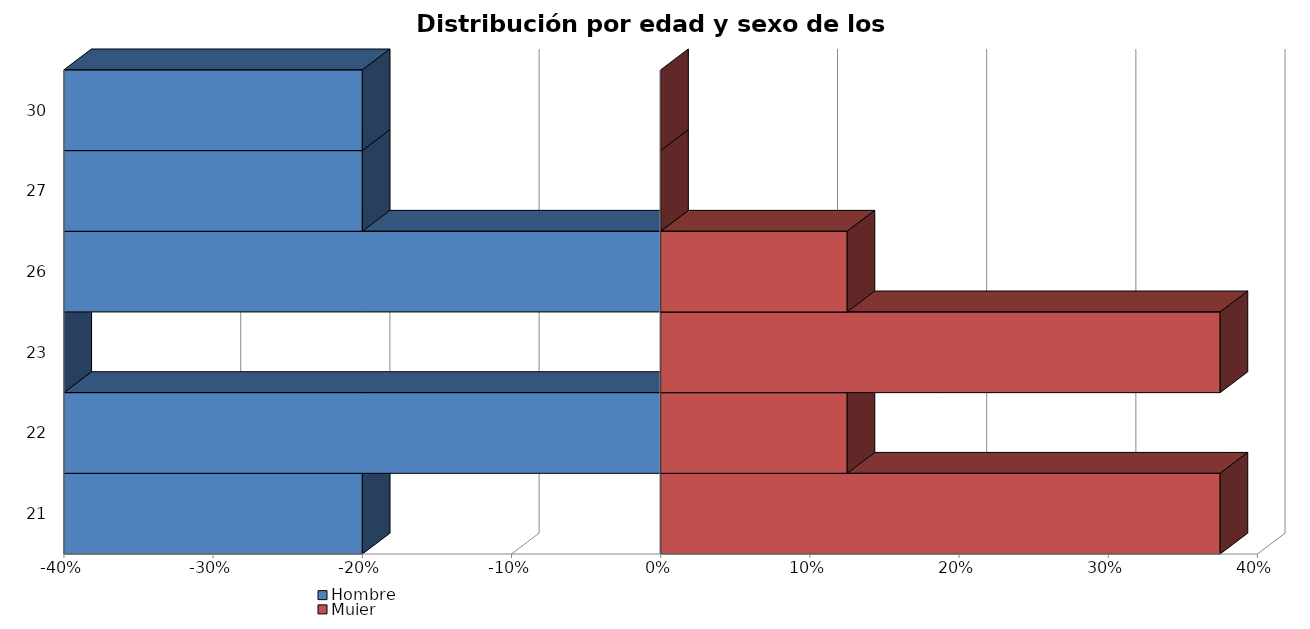
| Category | Hombre | Mujer |
|---|---|---|
| 21 | -0.2 | 0.375 |
| 22 | 0 | 0.125 |
| 23 | -0.4 | 0.375 |
| 26 | 0 | 0.125 |
| 27 | -0.2 | 0 |
| 30 | -0.2 | 0 |